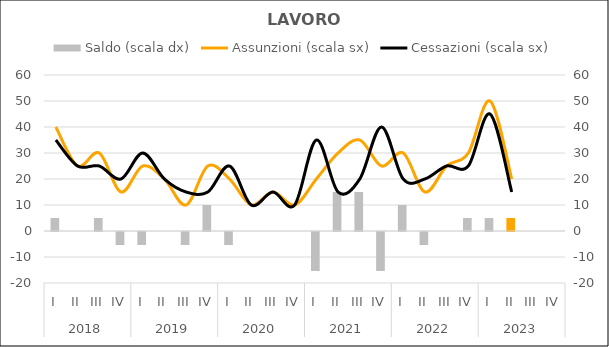
| Category | Saldo (scala dx) |
|---|---|
| 0 | 5 |
| 1 | 0 |
| 2 | 5 |
| 3 | -5 |
| 4 | -5 |
| 5 | 0 |
| 6 | -5 |
| 7 | 10 |
| 8 | -5 |
| 9 | 0 |
| 10 | 0 |
| 11 | 0 |
| 12 | -15 |
| 13 | 15 |
| 14 | 15 |
| 15 | -15 |
| 16 | 10 |
| 17 | -5 |
| 18 | 0 |
| 19 | 5 |
| 20 | 5 |
| 21 | 5 |
| 22 | 0 |
| 23 | 0 |